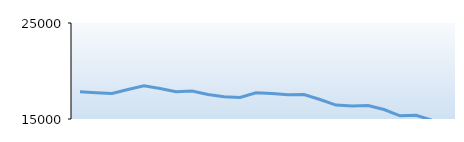
| Category | Kevin Frick |
|---|---|
| 0 | 17833 |
| 1 | 17739 |
| 2 | 17664 |
| 3 | 18065 |
| 4 | 18466 |
| 5 | 18174 |
| 6 | 17844 |
| 7 | 17905 |
| 8 | 17547 |
| 9 | 17319 |
| 10 | 17248 |
| 11 | 17728 |
| 12 | 17668 |
| 13 | 17528 |
| 14 | 17550 |
| 15 | 17032 |
| 16 | 16448 |
| 17 | 16359 |
| 18 | 16397 |
| 19 | 15988 |
| 20 | 15332 |
| 21 | 15388 |
| 22 | 14871 |
| 23 | 14507 |